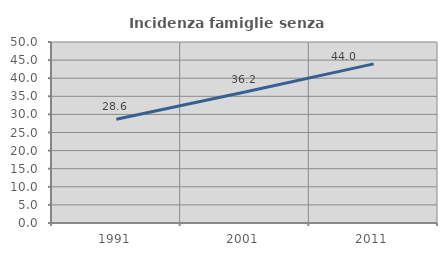
| Category | Incidenza famiglie senza nuclei |
|---|---|
| 1991.0 | 28.647 |
| 2001.0 | 36.197 |
| 2011.0 | 43.958 |